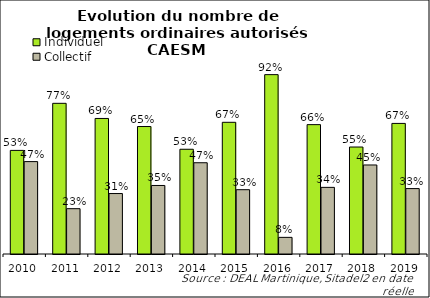
| Category | Individuel | Collectif |
|---|---|---|
| 2010.0 | 0.529 | 0.471 |
| 2011.0 | 0.769 | 0.231 |
| 2012.0 | 0.692 | 0.308 |
| 2013.0 | 0.65 | 0.35 |
| 2014.0 | 0.534 | 0.466 |
| 2015.0 | 0.672 | 0.328 |
| 2016.0 | 0.915 | 0.085 |
| 2017.0 | 0.66 | 0.34 |
| 2018.0 | 0.546 | 0.454 |
| 2019.0 | 0.666 | 0.334 |